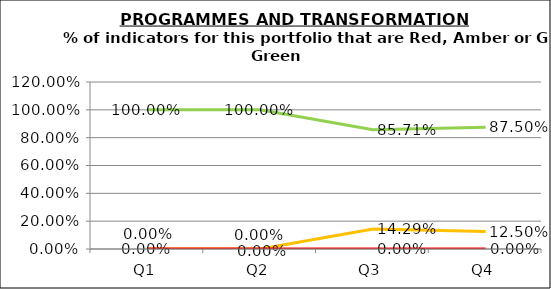
| Category | Green | Amber | Red |
|---|---|---|---|
| Q1 | 1 | 0 | 0 |
| Q2 | 1 | 0 | 0 |
| Q3 | 0.857 | 0.143 | 0 |
| Q4 | 0.875 | 0.125 | 0 |